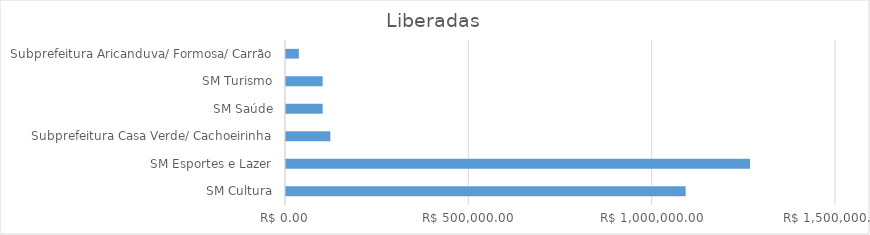
| Category | Series 0 |
|---|---|
| SM Cultura | 1090000 |
| SM Esportes e Lazer | 1265499.3 |
| Subprefeitura Casa Verde/ Cachoeirinha | 120910.64 |
| SM Saúde | 100000 |
| SM Turismo | 100000 |
| Subprefeitura Aricanduva/ Formosa/ Carrão | 35000 |